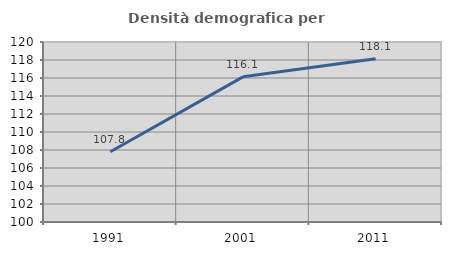
| Category | Densità demografica |
|---|---|
| 1991.0 | 107.805 |
| 2001.0 | 116.127 |
| 2011.0 | 118.145 |